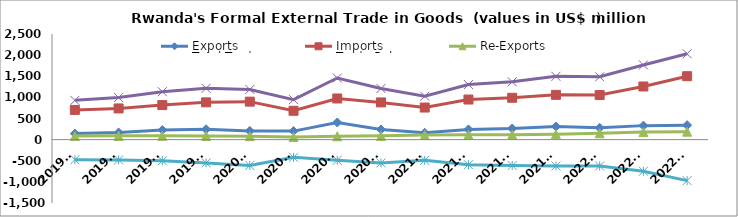
| Category | Exports | Imports | Re-Exports | Total Trade | Trade Balance |
|---|---|---|---|---|---|
| 2019Q1 | 142.226 | 702.457 | 84.537 | 929.22 | -475.694 |
| 2019Q2 | 168.991 | 737.888 | 89.17 | 996.048 | -479.727 |
| 2019Q3 | 226.991 | 816.871 | 90.481 | 1134.343 | -499.399 |
| 2019Q4 | 244.881 | 882.342 | 86.987 | 1214.21 | -550.474 |
| 2020Q1 | 206.757 | 898.996 | 81.633 | 1187.386 | -610.606 |
| 2020Q2 | 201.77 | 682.838 | 62.103 | 946.711 | -418.965 |
| 2020Q3 | 405.953 | 973.662 | 78.856 | 1458.471 | -488.853 |
| 2020Q4 | 240.244 | 880.636 | 89.074 | 1209.954 | -551.318 |
| 2021Q1 | 161.83 | 759.383 | 107.52 | 1028.733 | -490.033 |
| 2021Q2 | 241.484 | 948.948 | 113.328 | 1303.761 | -594.135 |
| 2021Q3 | 263.416 | 990.421 | 114.805 | 1368.643 | -612.2 |
| 2021Q4 | 310.514 | 1060.28 | 127.194 | 1497.988 | -622.572 |
| 2022Q1 | 280.673 | 1055.385 | 150.457 | 1486.514 | -624.255 |
| 2022Q2 | 331.324 | 1257.722 | 178.23 | 1767.275 | -748.168 |
| 2022Q3 | 342.685 | 1500.789 | 187.764 | 2031.239 | -970.34 |